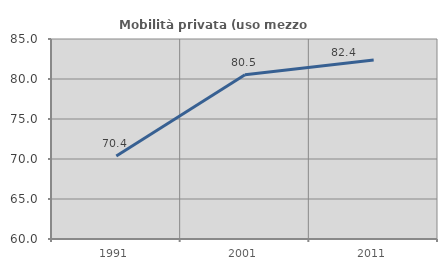
| Category | Mobilità privata (uso mezzo privato) |
|---|---|
| 1991.0 | 70.372 |
| 2001.0 | 80.524 |
| 2011.0 | 82.377 |